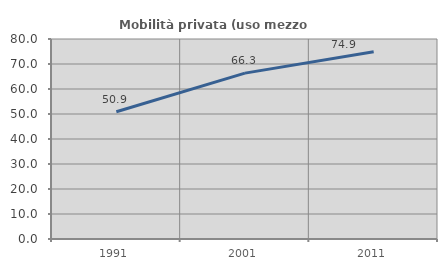
| Category | Mobilità privata (uso mezzo privato) |
|---|---|
| 1991.0 | 50.905 |
| 2001.0 | 66.348 |
| 2011.0 | 74.894 |